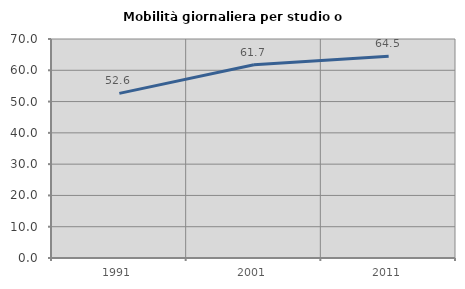
| Category | Mobilità giornaliera per studio o lavoro |
|---|---|
| 1991.0 | 52.611 |
| 2001.0 | 61.749 |
| 2011.0 | 64.496 |